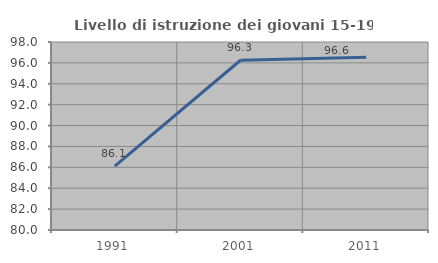
| Category | Livello di istruzione dei giovani 15-19 anni |
|---|---|
| 1991.0 | 86.118 |
| 2001.0 | 96.254 |
| 2011.0 | 96.552 |